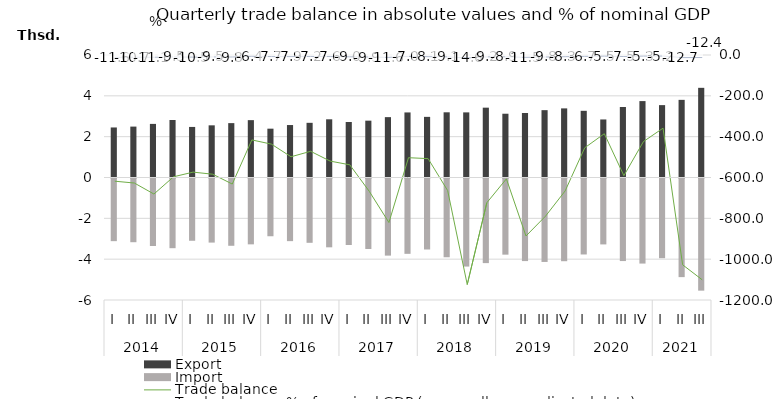
| Category | Export | Import |
|---|---|---|
| 0 | 2450.7 | -3068.8 |
| 1 | 2493.4 | -3120.5 |
| 2 | 2625.5 | -3306.5 |
| 3 | 2816.7 | -3413.2 |
| 4 | 2476.5 | -3050.1 |
| 5 | 2555.2 | -3139.2 |
| 6 | 2663.4 | -3295.5 |
| 7 | 2809.5 | -3225.4 |
| 8 | 2391.5 | -2828.1 |
| 9 | 2569.5 | -3068 |
| 10 | 2678.2 | -3149.9 |
| 11 | 2850.8 | -3370.5 |
| 12 | 2719.6 | -3257.4 |
| 13 | 2783.8 | -3452 |
| 14 | 2956.9 | -3777.4 |
| 15 | 3187 | -3690 |
| 16 | 2969.9 | -3477.4 |
| 17 | 3193.3 | -3857.4 |
| 18 | 3189.7 | -4313.9 |
| 19 | 3420.5 | -4144.2 |
| 20 | 3123.6 | -3730.2 |
| 21 | 3158.2 | -4044.8 |
| 22 | 3298.5 | -4087.5 |
| 23 | 3385.3 | -4051.1 |
| 24 | 3266.4 | -3720.9 |
| 25 | 2842.7 | -3228.3 |
| 26 | 3452.8 | -4043.7 |
| 27 | 3742.7 | -4166.6 |
| 28 | 3545 | -3903.3 |
| 29 | 3802.9 | -4830.5 |
| 30 | 4392.2 | -5493.2 |